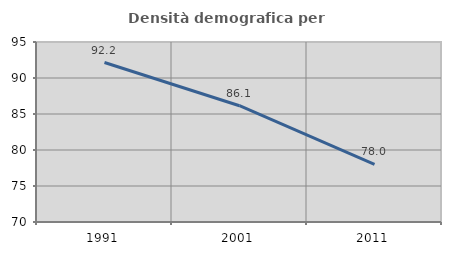
| Category | Densità demografica |
|---|---|
| 1991.0 | 92.15 |
| 2001.0 | 86.148 |
| 2011.0 | 78.008 |